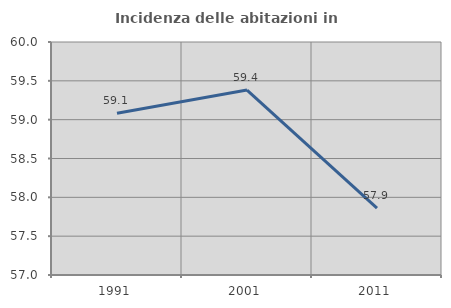
| Category | Incidenza delle abitazioni in proprietà  |
|---|---|
| 1991.0 | 59.084 |
| 2001.0 | 59.381 |
| 2011.0 | 57.86 |